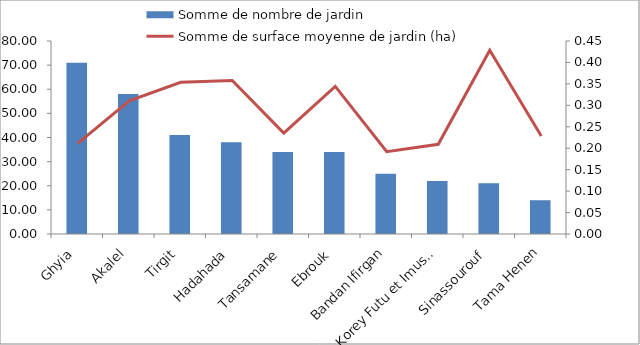
| Category | Somme de nombre de jardin |
|---|---|
| Ghyia | 71 |
| Akalel | 58 |
| Tirgit | 41 |
| Hadahada | 38 |
| Tansamane | 34 |
| Ebrouk | 34 |
| Bandan Ifirgan | 25 |
| Korey Futu et Imusan | 22 |
| Sinassourouf | 21 |
| Tama Henen | 14 |